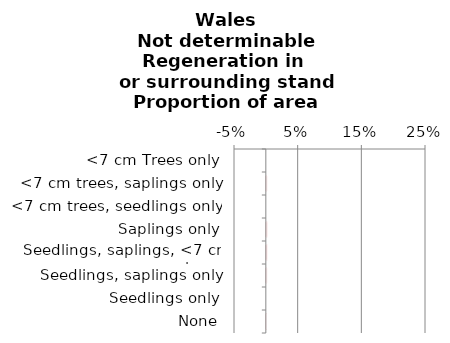
| Category | Not determinable |
|---|---|
| None | 0 |
| Seedlings only | 0 |
| Seedlings, saplings only | 0 |
| Seedlings, saplings, <7 cm trees | 0.001 |
| Saplings only | 0.001 |
| <7 cm trees, seedlings only | 0 |
| <7 cm trees, saplings only | 0 |
| <7 cm Trees only | 0 |